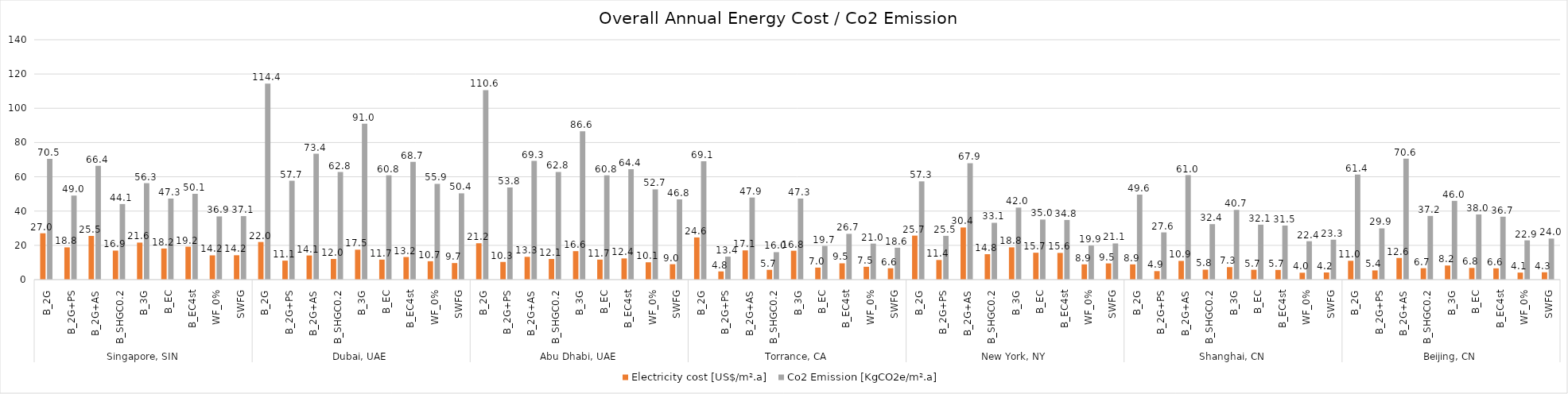
| Category | Electricity cost | Co2 Emission |
|---|---|---|
| 0 | 27.045 | 70.468 |
| 1 | 18.824 | 49.048 |
| 2 | 25.498 | 66.436 |
| 3 | 16.926 | 44.103 |
| 4 | 21.601 | 56.281 |
| 5 | 18.155 | 47.303 |
| 6 | 19.215 | 50.065 |
| 7 | 14.158 | 36.89 |
| 8 | 14.224 | 37.061 |
| 9 | 21.955 | 114.412 |
| 10 | 11.075 | 57.712 |
| 11 | 14.09 | 73.425 |
| 12 | 12.047 | 62.778 |
| 13 | 17.455 | 90.958 |
| 14 | 11.672 | 60.827 |
| 15 | 13.182 | 68.693 |
| 16 | 10.722 | 55.875 |
| 17 | 9.662 | 50.352 |
| 18 | 21.222 | 110.59 |
| 19 | 10.317 | 53.765 |
| 20 | 13.29 | 69.257 |
| 21 | 12.059 | 62.843 |
| 22 | 16.619 | 86.606 |
| 23 | 11.672 | 60.825 |
| 24 | 12.363 | 64.424 |
| 25 | 10.106 | 52.666 |
| 26 | 8.985 | 46.823 |
| 27 | 24.607 | 69.105 |
| 28 | 4.778 | 13.418 |
| 29 | 17.056 | 47.9 |
| 30 | 5.706 | 16.026 |
| 31 | 16.849 | 47.319 |
| 32 | 7.007 | 19.677 |
| 33 | 9.509 | 26.705 |
| 34 | 7.485 | 21.021 |
| 35 | 6.63 | 18.62 |
| 36 | 25.673 | 57.336 |
| 37 | 11.432 | 25.531 |
| 38 | 30.417 | 67.931 |
| 39 | 14.842 | 33.148 |
| 40 | 18.821 | 42.035 |
| 41 | 15.693 | 35.047 |
| 42 | 15.582 | 34.799 |
| 43 | 8.902 | 19.881 |
| 44 | 9.455 | 21.117 |
| 45 | 8.884 | 49.604 |
| 46 | 4.936 | 27.561 |
| 47 | 10.917 | 60.954 |
| 48 | 5.8 | 32.386 |
| 49 | 7.284 | 40.669 |
| 50 | 5.74 | 32.05 |
| 51 | 5.65 | 31.547 |
| 52 | 4.013 | 22.405 |
| 53 | 4.17 | 23.285 |
| 54 | 10.991 | 61.366 |
| 55 | 5.357 | 29.91 |
| 56 | 12.639 | 70.57 |
| 57 | 6.655 | 37.16 |
| 58 | 8.23 | 45.953 |
| 59 | 6.813 | 38.04 |
| 60 | 6.577 | 36.721 |
| 61 | 4.101 | 22.899 |
| 62 | 4.29 | 23.953 |